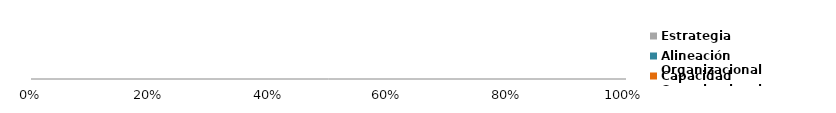
| Category | Estrategia | Alineación Organizacional | Capacidad Organizacional |
|---|---|---|---|
| 0 | 0 | 0 | 0 |